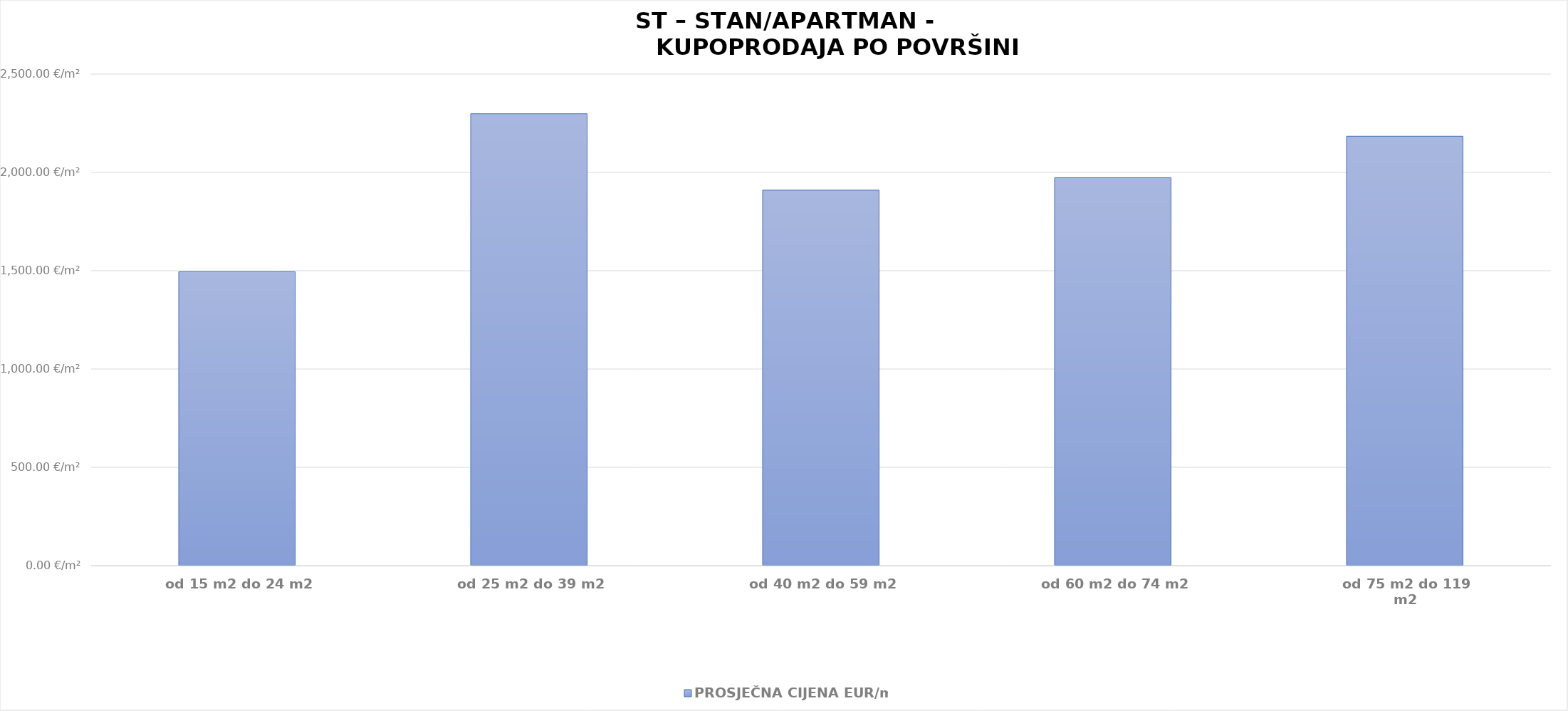
| Category | PROSJEČNA CIJENA EUR/m2 |
|---|---|
| od 15 m2 do 24 m2 | 1904-02-02 15:49:13 |
| od 25 m2 do 39 m2 | 1906-04-16 05:50:05 |
| od 40 m2 do 59 m2 | 1905-03-23 20:10:40 |
| od 60 m2 do 74 m2 | 1905-05-26 04:58:34 |
| od 75 m2 do 119 m2 | 1905-12-22 18:24:04 |